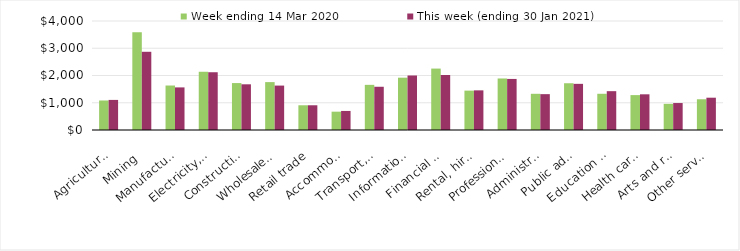
| Category | Week ending 14 Mar 2020 | This week (ending 30 Jan 2021) |
|---|---|---|
| Agriculture, forestry and fishing | 1082.88 | 1104.21 |
| Mining | 3584.81 | 2870.3 |
| Manufacturing | 1632.31 | 1563.34 |
| Electricity, gas, water and waste services | 2137.04 | 2119.75 |
| Construction | 1722.05 | 1676.91 |
| Wholesale trade | 1757.46 | 1630.03 |
| Retail trade | 907.53 | 907.81 |
| Accommodation and food services | 672.67 | 699.5 |
| Transport, postal and warehousing | 1656.8 | 1586.84 |
| Information media and telecommunications | 1920.02 | 2000.36 |
| Financial and insurance services | 2253.87 | 2019.13 |
| Rental, hiring and real estate services | 1444.99 | 1455.03 |
| Professional, scientific and technical services | 1890.3 | 1874 |
| Administrative and support services | 1328.51 | 1315.83 |
| Public administration and safety | 1716.11 | 1693.55 |
| Education and training | 1329.23 | 1425.17 |
| Health care and social assistance | 1280.68 | 1309.74 |
| Arts and recreation services | 960.67 | 989.6 |
| Other services | 1128.03 | 1185.35 |